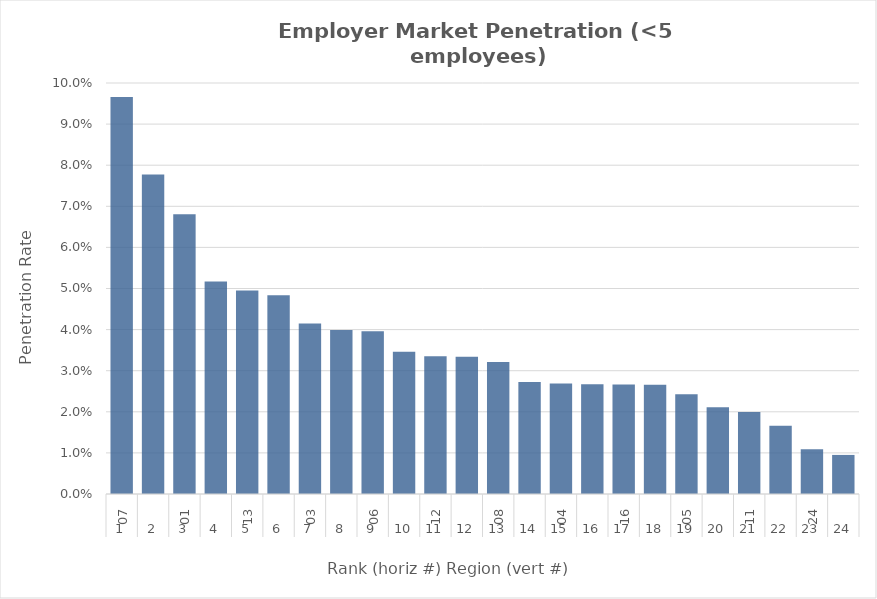
| Category | Rate |
|---|---|
| 0 | 0.097 |
| 1 | 0.078 |
| 2 | 0.068 |
| 3 | 0.052 |
| 4 | 0.05 |
| 5 | 0.048 |
| 6 | 0.041 |
| 7 | 0.04 |
| 8 | 0.04 |
| 9 | 0.035 |
| 10 | 0.034 |
| 11 | 0.033 |
| 12 | 0.032 |
| 13 | 0.027 |
| 14 | 0.027 |
| 15 | 0.027 |
| 16 | 0.027 |
| 17 | 0.027 |
| 18 | 0.024 |
| 19 | 0.021 |
| 20 | 0.02 |
| 21 | 0.017 |
| 22 | 0.011 |
| 23 | 0.01 |